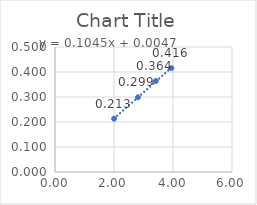
| Category | Series 0 |
|---|---|
| 2.003 | 0.213 |
| 2.811066666666667 | 0.299 |
| 3.4198333333333335 | 0.364 |
| 3.9448000000000008 | 0.416 |